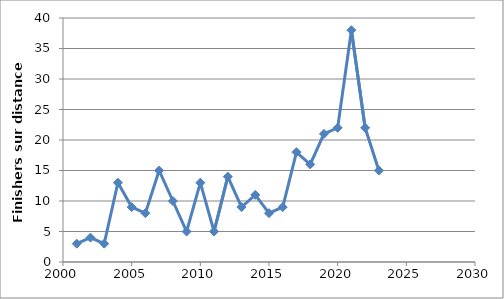
| Category | Series 0 |
|---|---|
| 2001.0 | 3 |
| 2002.0 | 4 |
| 2003.0 | 3 |
| 2004.0 | 13 |
| 2005.0 | 9 |
| 2006.0 | 8 |
| 2007.0 | 15 |
| 2008.0 | 10 |
| 2009.0 | 5 |
| 2010.0 | 13 |
| 2011.0 | 5 |
| 2012.0 | 14 |
| 2013.0 | 9 |
| 2014.0 | 11 |
| 2015.0 | 8 |
| 2016.0 | 9 |
| 2017.0 | 18 |
| 2018.0 | 16 |
| 2019.0 | 21 |
| 2020.0 | 22 |
| 2021.0 | 38 |
| 2022.0 | 22 |
| 2023.0 | 15 |